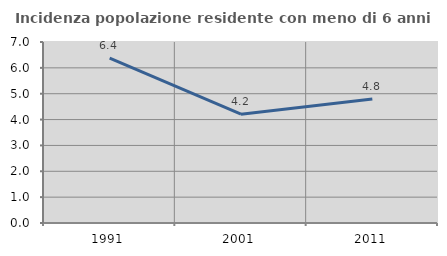
| Category | Incidenza popolazione residente con meno di 6 anni |
|---|---|
| 1991.0 | 6.374 |
| 2001.0 | 4.21 |
| 2011.0 | 4.794 |